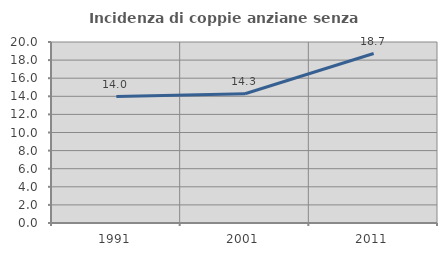
| Category | Incidenza di coppie anziane senza figli  |
|---|---|
| 1991.0 | 13.974 |
| 2001.0 | 14.286 |
| 2011.0 | 18.728 |